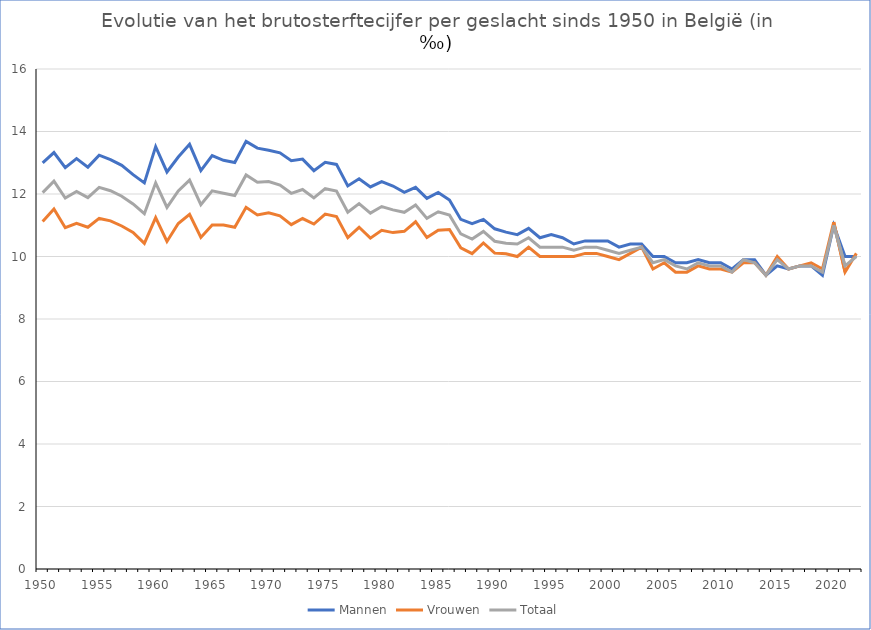
| Category | Mannen | Vrouwen | Totaal |
|---|---|---|---|
| 1950.0 | 12.994 | 11.12 | 12.042 |
| 1951.0 | 13.327 | 11.518 | 12.409 |
| 1952.0 | 12.845 | 10.923 | 11.869 |
| 1953.0 | 13.131 | 11.059 | 12.079 |
| 1954.0 | 12.86 | 10.937 | 11.882 |
| 1955.0 | 13.243 | 11.219 | 12.214 |
| 1956.0 | 13.101 | 11.141 | 12.104 |
| 1957.0 | 12.916 | 10.976 | 11.93 |
| 1958.0 | 12.621 | 10.773 | 11.681 |
| 1959.0 | 12.355 | 10.421 | 11.37 |
| 1960.0 | 13.514 | 11.243 | 12.357 |
| 1961.0 | 12.705 | 10.481 | 11.57 |
| 1962.0 | 13.183 | 11.057 | 12.097 |
| 1963.0 | 13.59 | 11.347 | 12.446 |
| 1964.0 | 12.75 | 10.61 | 11.659 |
| 1965.0 | 13.231 | 11.009 | 12.1 |
| 1966.0 | 13.079 | 11.007 | 12.023 |
| 1967.0 | 13.007 | 10.936 | 11.952 |
| 1968.0 | 13.684 | 11.575 | 12.608 |
| 1969.0 | 13.467 | 11.328 | 12.376 |
| 1970.0 | 13.4 | 11.4 | 12.4 |
| 1971.0 | 13.317 | 11.3 | 12.287 |
| 1972.0 | 13.066 | 11.021 | 12.022 |
| 1973.0 | 13.116 | 11.215 | 12.145 |
| 1974.0 | 12.747 | 11.038 | 11.874 |
| 1975.0 | 13.016 | 11.358 | 12.17 |
| 1976.0 | 12.947 | 11.281 | 12.096 |
| 1977.0 | 12.259 | 10.605 | 11.414 |
| 1978.0 | 12.486 | 10.935 | 11.694 |
| 1979.0 | 12.226 | 10.587 | 11.388 |
| 1980.0 | 12.398 | 10.836 | 11.6 |
| 1981.0 | 12.255 | 10.765 | 11.493 |
| 1982.0 | 12.052 | 10.807 | 11.415 |
| 1983.0 | 12.213 | 11.112 | 11.65 |
| 1984.0 | 11.862 | 10.607 | 11.22 |
| 1985.0 | 12.05 | 10.841 | 11.431 |
| 1986.0 | 11.808 | 10.862 | 11.324 |
| 1987.0 | 11.188 | 10.28 | 10.723 |
| 1988.0 | 11.051 | 10.09 | 10.559 |
| 1989.0 | 11.186 | 10.432 | 10.8 |
| 1990.0 | 10.887 | 10.108 | 10.489 |
| 1991.0 | 10.781 | 10.088 | 10.427 |
| 1992.0 | 10.7 | 10 | 10.4 |
| 1993.0 | 10.9 | 10.3 | 10.6 |
| 1994.0 | 10.6 | 10 | 10.3 |
| 1995.0 | 10.7 | 10 | 10.3 |
| 1996.0 | 10.6 | 10 | 10.3 |
| 1997.0 | 10.4 | 10 | 10.2 |
| 1998.0 | 10.5 | 10.1 | 10.3 |
| 1999.0 | 10.5 | 10.1 | 10.3 |
| 2000.0 | 10.5 | 10 | 10.2 |
| 2001.0 | 10.3 | 9.9 | 10.1 |
| 2002.0 | 10.4 | 10.1 | 10.2 |
| 2003.0 | 10.4 | 10.3 | 10.3 |
| 2004.0 | 10 | 9.6 | 9.8 |
| 2005.0 | 10 | 9.8 | 9.9 |
| 2006.0 | 9.8 | 9.5 | 9.7 |
| 2007.0 | 9.8 | 9.5 | 9.6 |
| 2008.0 | 9.9 | 9.7 | 9.8 |
| 2009.0 | 9.8 | 9.6 | 9.7 |
| 2010.0 | 9.8 | 9.6 | 9.7 |
| 2011.0 | 9.6 | 9.5 | 9.5 |
| 2012.0 | 9.9 | 9.8 | 9.9 |
| 2013.0 | 9.9 | 9.8 | 9.8 |
| 2014.0 | 9.4 | 9.4 | 9.4 |
| 2015.0 | 9.7 | 10 | 9.9 |
| 2016.0 | 9.6 | 9.6 | 9.6 |
| 2017.0 | 9.7 | 9.7 | 9.7 |
| 2018.0 | 9.7 | 9.8 | 9.7 |
| 2019.0 | 9.4 | 9.6 | 9.5 |
| 2020.0 | 11 | 11.1 | 11 |
| 2021.0 | 10 | 9.5 | 9.7 |
| 2022.0 | 10 | 10.1 | 10 |